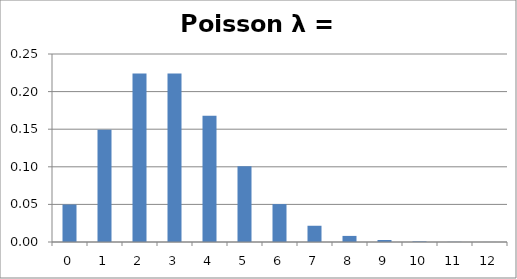
| Category | Series 0 |
|---|---|
| 0.0 | 0.05 |
| 1.0 | 0.149 |
| 2.0 | 0.224 |
| 3.0 | 0.224 |
| 4.0 | 0.168 |
| 5.0 | 0.101 |
| 6.0 | 0.05 |
| 7.0 | 0.022 |
| 8.0 | 0.008 |
| 9.0 | 0.003 |
| 10.0 | 0.001 |
| 11.0 | 0 |
| 12.0 | 0 |